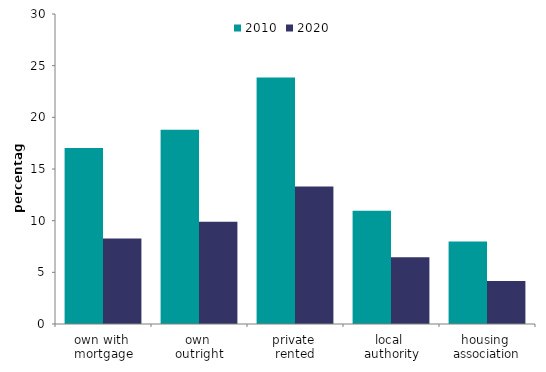
| Category | 2010 | 2020 |
|---|---|---|
| own with 
mortgage | 17.032 | 8.265 |
| own 
outright | 18.806 | 9.887 |
| private 
rented | 23.86 | 13.308 |
| local 
authority | 10.963 | 6.449 |
| housing 
association | 7.986 | 4.151 |